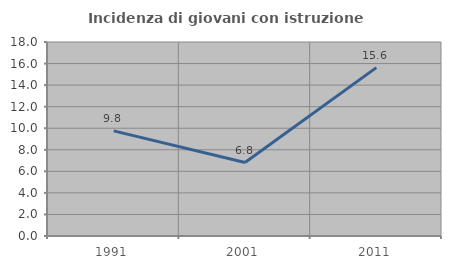
| Category | Incidenza di giovani con istruzione universitaria |
|---|---|
| 1991.0 | 9.756 |
| 2001.0 | 6.818 |
| 2011.0 | 15.625 |